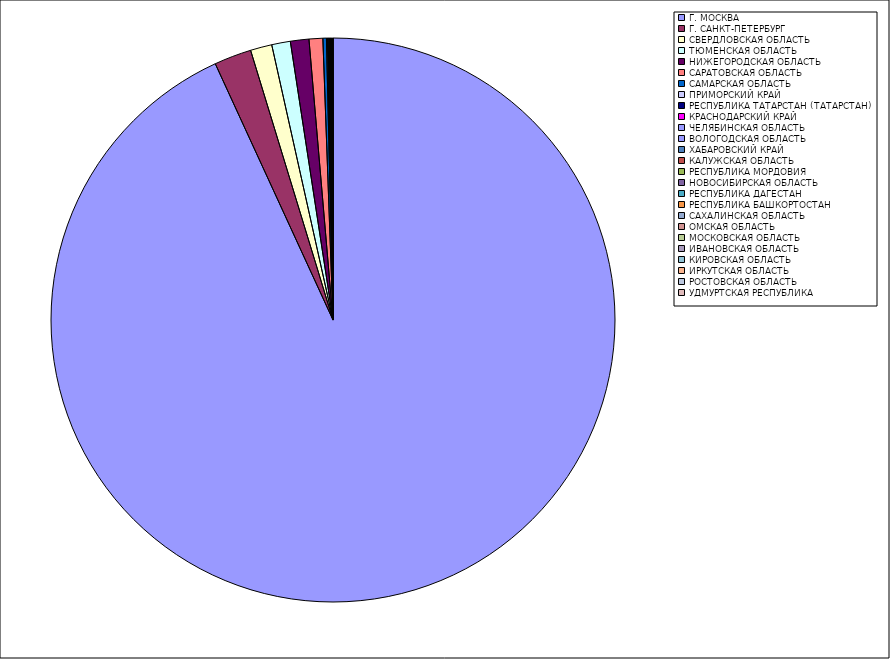
| Category | Оборот |
|---|---|
| Г. МОСКВА | 93.112 |
| Г. САНКТ-ПЕТЕРБУРГ | 2.135 |
| СВЕРДЛОВСКАЯ ОБЛАСТЬ | 1.231 |
| ТЮМЕНСКАЯ ОБЛАСТЬ | 1.067 |
| НИЖЕГОРОДСКАЯ ОБЛАСТЬ | 1.061 |
| САРАТОВСКАЯ ОБЛАСТЬ | 0.786 |
| САМАРСКАЯ ОБЛАСТЬ | 0.201 |
| ПРИМОРСКИЙ КРАЙ | 0.057 |
| РЕСПУБЛИКА ТАТАРСТАН (ТАТАРСТАН) | 0.045 |
| КРАСНОДАРСКИЙ КРАЙ | 0.042 |
| ЧЕЛЯБИНСКАЯ ОБЛАСТЬ | 0.03 |
| ВОЛОГОДСКАЯ ОБЛАСТЬ | 0.028 |
| ХАБАРОВСКИЙ КРАЙ | 0.023 |
| КАЛУЖСКАЯ ОБЛАСТЬ | 0.022 |
| РЕСПУБЛИКА МОРДОВИЯ | 0.021 |
| НОВОСИБИРСКАЯ ОБЛАСТЬ | 0.014 |
| РЕСПУБЛИКА ДАГЕСТАН | 0.013 |
| РЕСПУБЛИКА БАШКОРТОСТАН | 0.012 |
| САХАЛИНСКАЯ ОБЛАСТЬ | 0.011 |
| ОМСКАЯ ОБЛАСТЬ | 0.01 |
| МОСКОВСКАЯ ОБЛАСТЬ | 0.009 |
| ИВАНОВСКАЯ ОБЛАСТЬ | 0.008 |
| КИРОВСКАЯ ОБЛАСТЬ | 0.008 |
| ИРКУТСКАЯ ОБЛАСТЬ | 0.006 |
| РОСТОВСКАЯ ОБЛАСТЬ | 0.006 |
| УДМУРТСКАЯ РЕСПУБЛИКА | 0.005 |